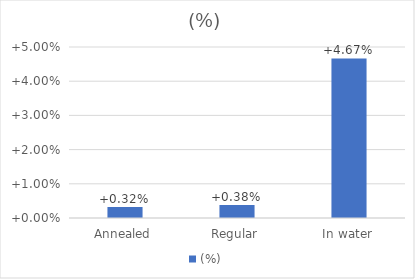
| Category | (%) |
|---|---|
| Annealed | 0.003 |
| Regular | 0.004 |
| In water | 0.047 |